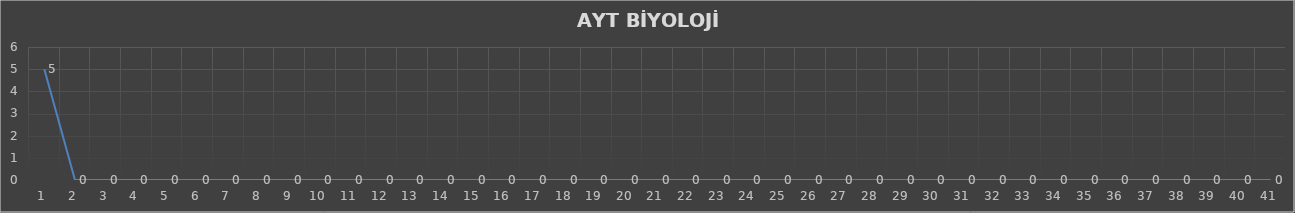
| Category | Series 0 |
|---|---|
| 0 | 5 |
| 1 | 0 |
| 2 | 0 |
| 3 | 0 |
| 4 | 0 |
| 5 | 0 |
| 6 | 0 |
| 7 | 0 |
| 8 | 0 |
| 9 | 0 |
| 10 | 0 |
| 11 | 0 |
| 12 | 0 |
| 13 | 0 |
| 14 | 0 |
| 15 | 0 |
| 16 | 0 |
| 17 | 0 |
| 18 | 0 |
| 19 | 0 |
| 20 | 0 |
| 21 | 0 |
| 22 | 0 |
| 23 | 0 |
| 24 | 0 |
| 25 | 0 |
| 26 | 0 |
| 27 | 0 |
| 28 | 0 |
| 29 | 0 |
| 30 | 0 |
| 31 | 0 |
| 32 | 0 |
| 33 | 0 |
| 34 | 0 |
| 35 | 0 |
| 36 | 0 |
| 37 | 0 |
| 38 | 0 |
| 39 | 0 |
| 40 | 0 |